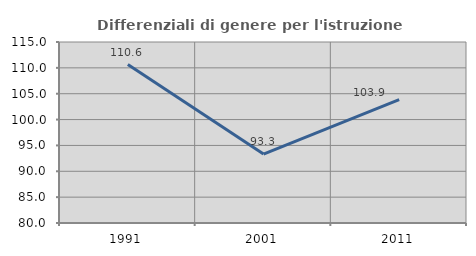
| Category | Differenziali di genere per l'istruzione superiore |
|---|---|
| 1991.0 | 110.638 |
| 2001.0 | 93.327 |
| 2011.0 | 103.877 |